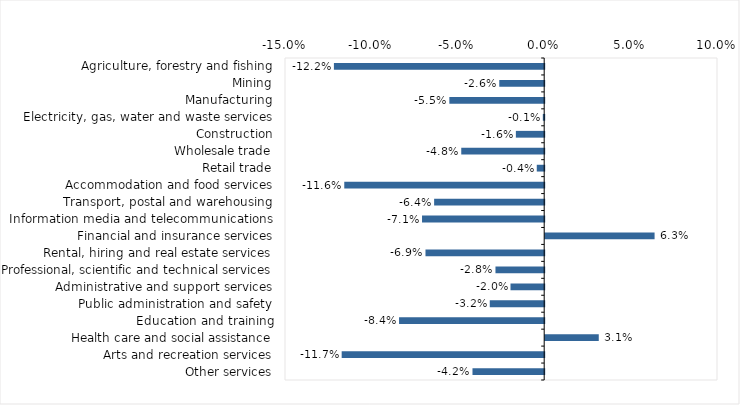
| Category | This week |
|---|---|
| Agriculture, forestry and fishing | -0.122 |
| Mining | -0.026 |
| Manufacturing | -0.055 |
| Electricity, gas, water and waste services | -0.001 |
| Construction | -0.016 |
| Wholesale trade | -0.048 |
| Retail trade | -0.004 |
| Accommodation and food services | -0.116 |
| Transport, postal and warehousing | -0.064 |
| Information media and telecommunications | -0.071 |
| Financial and insurance services | 0.063 |
| Rental, hiring and real estate services | -0.069 |
| Professional, scientific and technical services | -0.028 |
| Administrative and support services | -0.02 |
| Public administration and safety | -0.032 |
| Education and training | -0.084 |
| Health care and social assistance | 0.031 |
| Arts and recreation services | -0.117 |
| Other services | -0.042 |